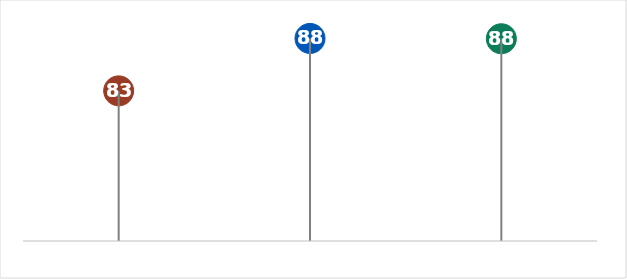
| Category | 2020 |
|---|---|
| 0 | 83.228 |
| 1 | 87.846 |
| 2 | 87.82 |